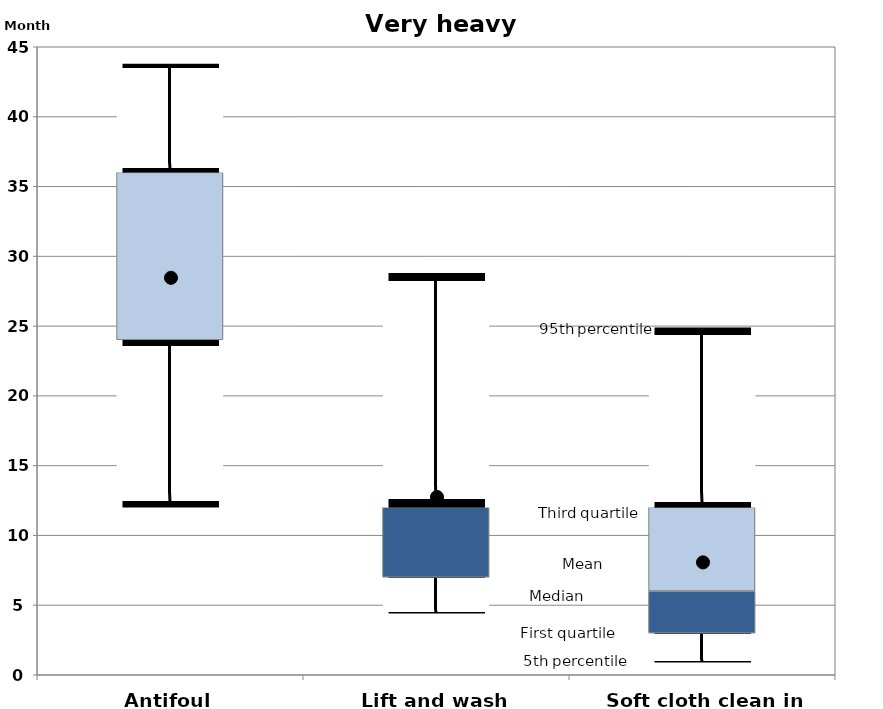
| Category | 5th percentile | First quartile | Second quartile | Third quartile | 95th percentile |
|---|---|---|---|---|---|
| Antifoul | 12 | 12 | 0 | 12 | 7.8 |
| Lift and wash | 4.4 | 2.6 | 5 | 0 | 16.8 |
| Soft cloth clean in water | 0.888 | 2.112 | 3 | 6 | 12.9 |